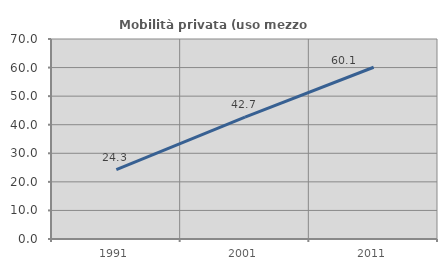
| Category | Mobilità privata (uso mezzo privato) |
|---|---|
| 1991.0 | 24.277 |
| 2001.0 | 42.671 |
| 2011.0 | 60.117 |